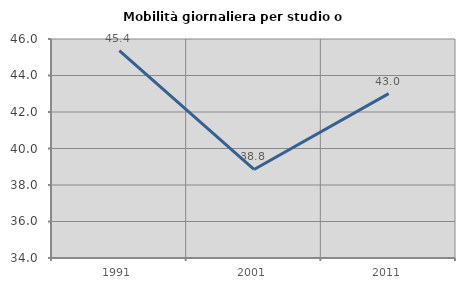
| Category | Mobilità giornaliera per studio o lavoro |
|---|---|
| 1991.0 | 45.369 |
| 2001.0 | 38.85 |
| 2011.0 | 43.009 |